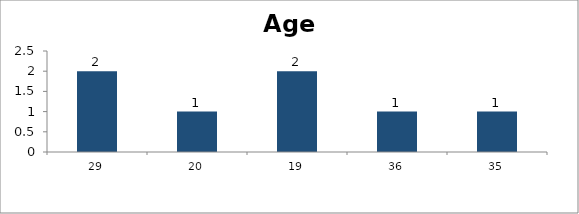
| Category | Age |
|---|---|
| 29.0 | 2 |
| 20.0 | 1 |
| 19.0 | 2 |
| 36.0 | 1 |
| 35.0 | 1 |